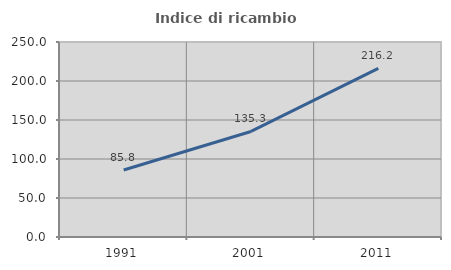
| Category | Indice di ricambio occupazionale  |
|---|---|
| 1991.0 | 85.821 |
| 2001.0 | 135.298 |
| 2011.0 | 216.159 |